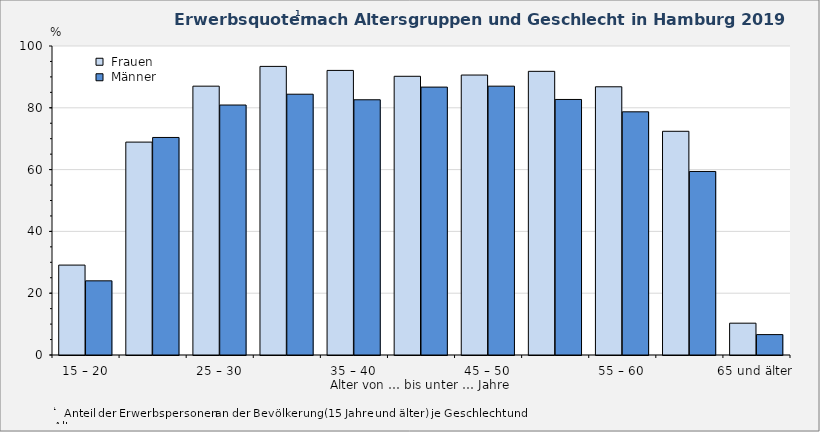
| Category |  Frauen |  Männer |
|---|---|---|
| 15 – 20 | 29.1 | 24 |
| 20 – 25 | 68.9 | 70.4 |
| 25 – 30 | 87 | 80.9 |
| 30 – 35 | 93.4 | 84.4 |
| 35 – 40 | 92.1 | 82.6 |
| 40 – 45 | 90.2 | 86.7 |
| 45 – 50 | 90.6 | 87 |
| 50 – 55 | 91.8 | 82.7 |
| 55 – 60 | 86.8 | 78.7 |
| 60 – 65 | 72.4 | 59.4 |
| 65 und älter | 10.3 | 6.6 |